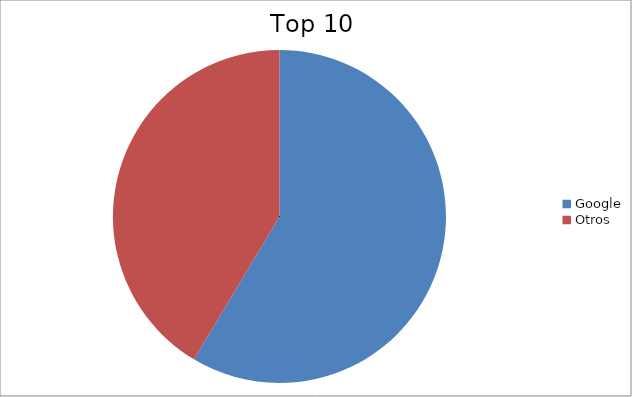
| Category | Series 0 |
|---|---|
| Google | 58.59 |
| Otros | 41.41 |